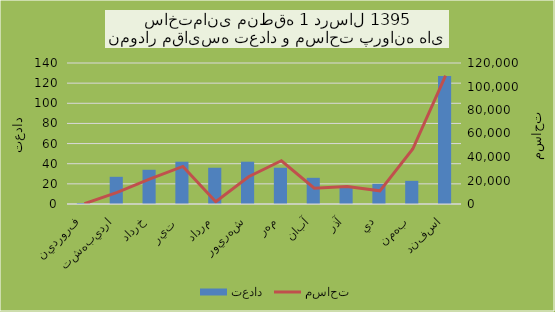
| Category | تعداد |
|---|---|
| فروردين | 1 |
| ارديبهشت | 27 |
| خرداد | 34 |
| تير  | 42 |
| مرداد | 36 |
| شهريور | 42 |
| مهر | 36 |
| آبان | 26 |
| آذر | 17 |
| دي | 20 |
| بهمن | 23 |
| اسفند | 127 |